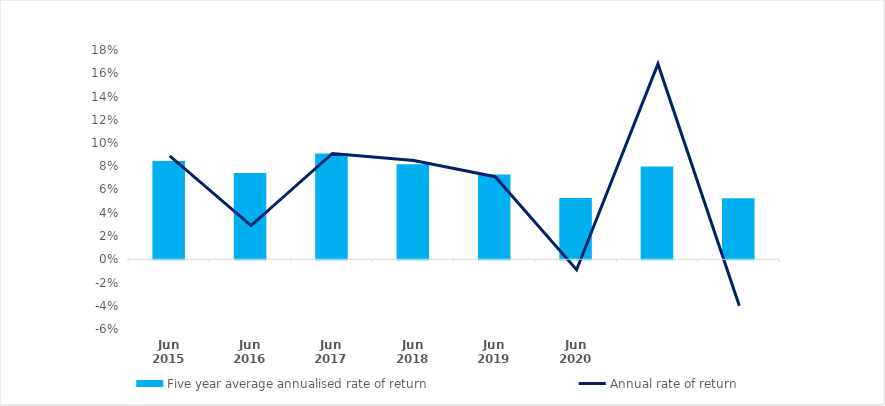
| Category | Five year average annualised rate of return |
|---|---|
| Jun 2015 | 0.085 |
| Jun 2016 | 0.074 |
| Jun 2017 | 0.091 |
| Jun 2018 | 0.082 |
| Jun 2019 | 0.073 |
| Jun 2020 | 0.053 |